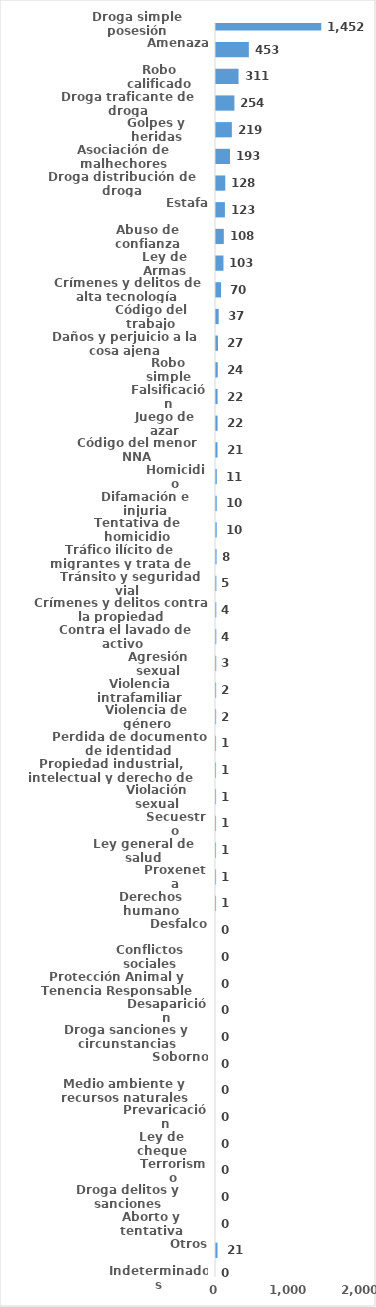
| Category | Series 0 |
|---|---|
| Droga simple posesión | 1452 |
| Amenaza | 453 |
| Robo calificado | 311 |
| Droga traficante de droga | 254 |
| Golpes y heridas | 219 |
| Asociación de malhechores | 193 |
| Droga distribución de droga | 128 |
| Estafa | 123 |
| Abuso de confianza | 108 |
| Ley de Armas | 103 |
| Crímenes y delitos de alta tecnología | 70 |
| Código del trabajo | 37 |
| Daños y perjuicio a la cosa ajena | 27 |
| Robo simple | 24 |
| Falsificación | 22 |
| Juego de azar | 22 |
| Código del menor NNA | 21 |
| Homicidio | 11 |
| Difamación e injuria | 10 |
| Tentativa de homicidio | 10 |
| Tráfico ilícito de migrantes y trata de personas | 8 |
| Tránsito y seguridad vial  | 5 |
| Crímenes y delitos contra la propiedad | 4 |
| Contra el lavado de activo  | 4 |
| Agresión sexual | 3 |
| Violencia intrafamiliar | 2 |
| Violencia de género | 2 |
| Perdida de documento de identidad | 1 |
| Propiedad industrial, intelectual y derecho de autor | 1 |
| Violación sexual | 1 |
| Secuestro | 1 |
| Ley general de salud | 1 |
| Proxeneta | 1 |
| Derechos humano | 1 |
| Desfalco | 0 |
| Conflictos sociales | 0 |
| Protección Animal y Tenencia Responsable | 0 |
| Desaparición | 0 |
| Droga sanciones y circunstancias agravantes | 0 |
| Soborno | 0 |
| Medio ambiente y recursos naturales | 0 |
| Prevaricación | 0 |
| Ley de cheque | 0 |
| Terrorismo | 0 |
| Droga delitos y sanciones | 0 |
| Aborto y tentativa | 0 |
| Otros | 21 |
| Indeterminados | 0 |